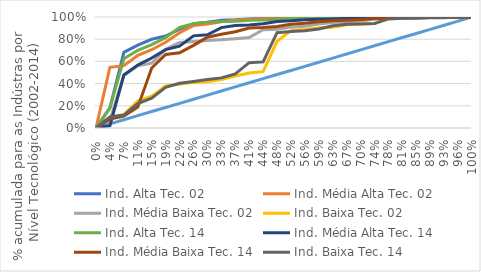
| Category | Ind. Alta Tec. 02 | Ind. Média Alta Tec. 02 | Ind. Média Baixa Tec. 02 | Ind. Baixa Tec. 02 | Diagonal | Ind. Alta Tec. 14 | Ind. Média Alta Tec. 14 | Ind. Média Baixa Tec. 14 | Ind. Baixa Tec. 14 |
|---|---|---|---|---|---|---|---|---|---|
| 0.0 | 0 | 0 | 0 | 0 | 0 | 0 | 0 | 0 | 0 |
| 0.037037037037037035 | 0.182 | 0.547 | 0.071 | 0.097 | 0.037 | 0.182 | 0.021 | 0.081 | 0.099 |
| 0.07407407407407407 | 0.682 | 0.562 | 0.474 | 0.12 | 0.074 | 0.624 | 0.477 | 0.108 | 0.117 |
| 0.1111111111111111 | 0.747 | 0.654 | 0.561 | 0.243 | 0.111 | 0.7 | 0.567 | 0.188 | 0.219 |
| 0.14814814814814814 | 0.799 | 0.705 | 0.584 | 0.287 | 0.148 | 0.75 | 0.631 | 0.541 | 0.269 |
| 0.18518518518518517 | 0.828 | 0.772 | 0.71 | 0.38 | 0.185 | 0.814 | 0.706 | 0.663 | 0.366 |
| 0.2222222222222222 | 0.89 | 0.858 | 0.77 | 0.396 | 0.222 | 0.906 | 0.737 | 0.678 | 0.403 |
| 0.25925925925925924 | 0.939 | 0.923 | 0.779 | 0.409 | 0.259 | 0.938 | 0.83 | 0.744 | 0.419 |
| 0.2962962962962963 | 0.953 | 0.937 | 0.788 | 0.416 | 0.296 | 0.954 | 0.839 | 0.818 | 0.438 |
| 0.3333333333333333 | 0.971 | 0.957 | 0.796 | 0.436 | 0.333 | 0.96 | 0.904 | 0.844 | 0.452 |
| 0.37037037037037035 | 0.975 | 0.97 | 0.805 | 0.469 | 0.37 | 0.962 | 0.924 | 0.867 | 0.487 |
| 0.4074074074074074 | 0.983 | 0.979 | 0.815 | 0.495 | 0.407 | 0.97 | 0.929 | 0.9 | 0.588 |
| 0.4444444444444444 | 0.988 | 0.984 | 0.885 | 0.508 | 0.444 | 0.973 | 0.938 | 0.906 | 0.596 |
| 0.48148148148148145 | 0.991 | 0.985 | 0.89 | 0.781 | 0.481 | 0.979 | 0.959 | 0.915 | 0.859 |
| 0.5185185185185185 | 0.994 | 0.987 | 0.909 | 0.877 | 0.519 | 0.986 | 0.965 | 0.935 | 0.87 |
| 0.5555555555555556 | 0.995 | 0.988 | 0.916 | 0.888 | 0.556 | 0.987 | 0.976 | 0.944 | 0.877 |
| 0.5925925925925926 | 0.997 | 0.99 | 0.936 | 0.902 | 0.593 | 0.991 | 0.979 | 0.957 | 0.891 |
| 0.6296296296296295 | 0.997 | 0.992 | 0.95 | 0.908 | 0.63 | 0.992 | 0.983 | 0.966 | 0.921 |
| 0.6666666666666665 | 0.998 | 0.993 | 0.957 | 0.931 | 0.667 | 0.994 | 0.986 | 0.971 | 0.935 |
| 0.7037037037037035 | 0.998 | 0.995 | 0.961 | 0.936 | 0.704 | 0.995 | 0.988 | 0.977 | 0.937 |
| 0.7407407407407405 | 0.999 | 0.996 | 0.984 | 0.94 | 0.741 | 0.996 | 0.989 | 0.984 | 0.942 |
| 0.7777777777777775 | 0.999 | 0.997 | 0.986 | 0.989 | 0.778 | 0.998 | 0.992 | 0.987 | 0.983 |
| 0.8148148148148144 | 0.999 | 0.998 | 0.994 | 0.99 | 0.815 | 0.999 | 0.996 | 0.99 | 0.988 |
| 0.8518518518518514 | 0.999 | 0.998 | 0.996 | 0.994 | 0.852 | 0.999 | 0.997 | 0.994 | 0.99 |
| 0.8888888888888884 | 1 | 1 | 0.997 | 0.995 | 0.889 | 1 | 1 | 0.995 | 0.994 |
| 0.9259259259259254 | 1 | 1 | 0.997 | 0.996 | 0.926 | 1 | 1 | 0.996 | 0.994 |
| 0.9629629629629624 | 1 | 1 | 0.997 | 0.996 | 0.963 | 1 | 1 | 0.996 | 0.999 |
| 0.9999999999999993 | 1 | 1 | 1 | 1 | 1 | 1 | 1 | 1 | 1 |